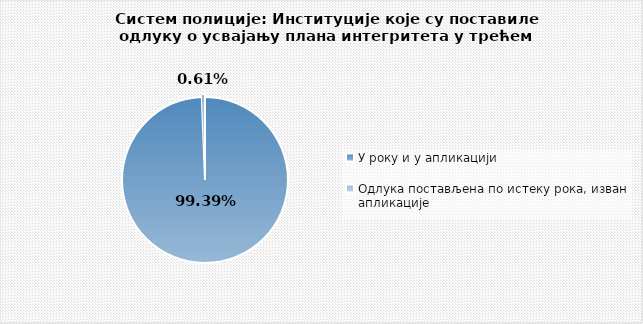
| Category | Series 0 |
|---|---|
| У року и у апликацији | 0.994 |
| Одлука постављена по истеку рока, изван апликације | 0.006 |